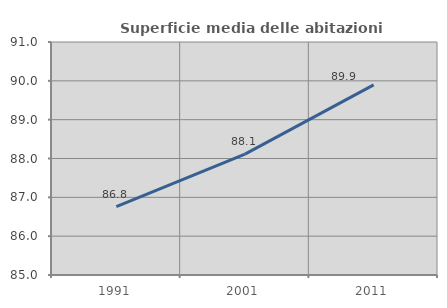
| Category | Superficie media delle abitazioni occupate |
|---|---|
| 1991.0 | 86.758 |
| 2001.0 | 88.113 |
| 2011.0 | 89.894 |